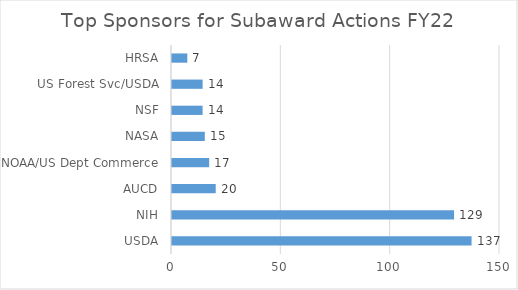
| Category | Total |
|---|---|
| USDA | 137 |
| NIH | 129 |
| AUCD | 20 |
| NOAA/US Dept Commerce | 17 |
| NASA | 15 |
| NSF | 14 |
| US Forest Svc/USDA | 14 |
| HRSA | 7 |